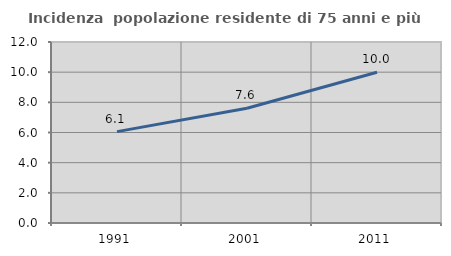
| Category | Incidenza  popolazione residente di 75 anni e più |
|---|---|
| 1991.0 | 6.058 |
| 2001.0 | 7.604 |
| 2011.0 | 9.994 |